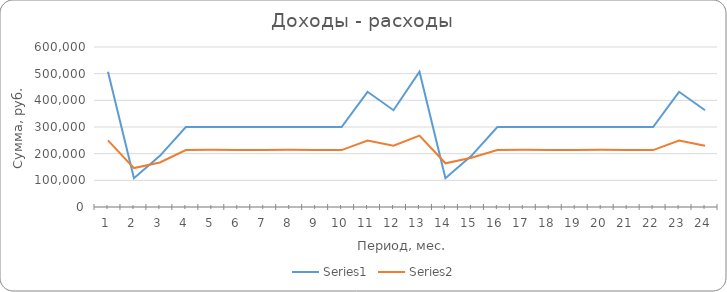
| Category | Series 0 | Series 1 |
|---|---|---|
| 0 | 507000 | 249672 |
| 1 | 108000 | 145868 |
| 2 | 192000 | 166932 |
| 3 | 300000 | 213300 |
| 4 | 300000 | 214300 |
| 5 | 300000 | 213300 |
| 6 | 300000 | 213300 |
| 7 | 300000 | 214300 |
| 8 | 300000 | 213300 |
| 9 | 300000 | 213300 |
| 10 | 432000 | 248972 |
| 11 | 363000 | 229848 |
| 12 | 507000 | 267672 |
| 13 | 108000 | 163868 |
| 14 | 192000 | 184932 |
| 15 | 300000 | 213300 |
| 16 | 300000 | 214300 |
| 17 | 300000 | 213300 |
| 18 | 300000 | 213300 |
| 19 | 300000 | 214300 |
| 20 | 300000 | 213300 |
| 21 | 300000 | 213300 |
| 22 | 432000 | 248972 |
| 23 | 363000 | 229848 |